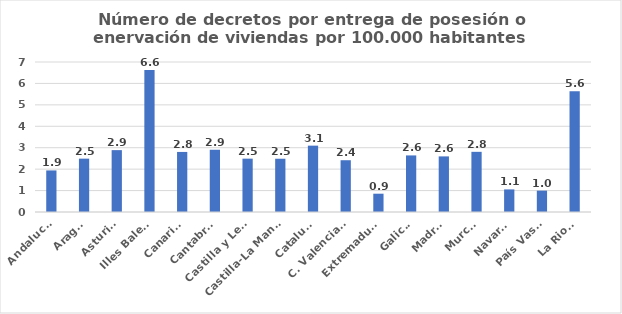
| Category | Numero de decretos por entrega de posesión o enervacion por 100.000 habitantes |
|---|---|
| Andalucía | 1.94 |
| Aragón | 2.49 |
| Asturias | 2.887 |
| Illes Balears | 6.631 |
| Canarias | 2.803 |
| Cantabria | 2.905 |
| Castilla y León | 2.489 |
| Castilla-La Mancha | 2.485 |
| Cataluña | 3.096 |
| C. Valenciana | 2.416 |
| Extremadura | 0.854 |
| Galicia | 2.64 |
| Madrid | 2.595 |
| Murcia | 2.808 |
| Navarra | 1.055 |
| País Vasco | 0.997 |
| La Rioja | 5.634 |